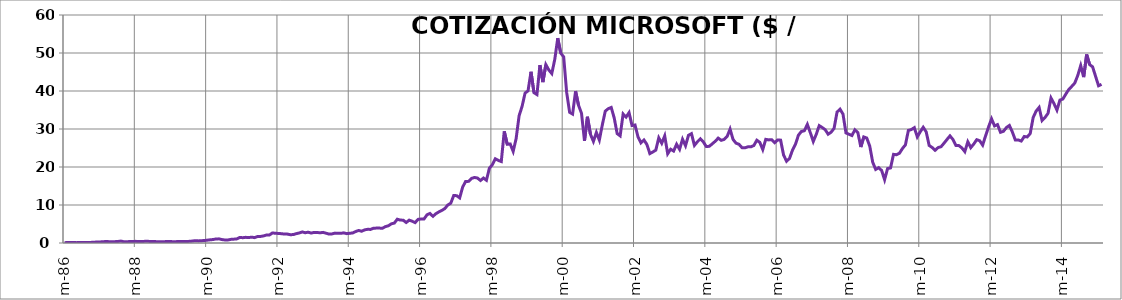
| Category | COTIZACIÓN MICROSOFT ($ / ACCIÓN) |
|---|---|
| 1986-03-13 | 0.097 |
| 1986-04-13 | 0.1 |
| 1986-05-13 | 0.112 |
| 1986-06-13 | 0.109 |
| 1986-07-13 | 0.097 |
| 1986-08-13 | 0.103 |
| 1986-09-13 | 0.098 |
| 1986-10-13 | 0.116 |
| 1986-11-13 | 0.146 |
| 1986-12-13 | 0.164 |
| 1987-01-13 | 0.208 |
| 1987-02-13 | 0.264 |
| 1987-03-13 | 0.287 |
| 1987-04-13 | 0.321 |
| 1987-05-13 | 0.423 |
| 1987-06-13 | 0.341 |
| 1987-07-13 | 0.345 |
| 1987-08-13 | 0.358 |
| 1987-09-13 | 0.404 |
| 1987-10-13 | 0.509 |
| 1987-11-13 | 0.335 |
| 1987-12-13 | 0.333 |
| 1988-01-13 | 0.394 |
| 1988-02-13 | 0.384 |
| 1988-03-13 | 0.434 |
| 1988-04-13 | 0.396 |
| 1988-05-13 | 0.394 |
| 1988-06-13 | 0.433 |
| 1988-07-13 | 0.464 |
| 1988-08-13 | 0.361 |
| 1988-09-13 | 0.375 |
| 1988-10-13 | 0.358 |
| 1988-11-13 | 0.331 |
| 1988-12-13 | 0.332 |
| 1989-01-13 | 0.368 |
| 1989-02-13 | 0.425 |
| 1989-03-13 | 0.366 |
| 1989-04-13 | 0.339 |
| 1989-05-13 | 0.377 |
| 1989-06-13 | 0.398 |
| 1989-07-13 | 0.368 |
| 1989-08-13 | 0.401 |
| 1989-09-13 | 0.432 |
| 1989-10-13 | 0.511 |
| 1989-11-13 | 0.612 |
| 1989-12-13 | 0.556 |
| 1990-01-13 | 0.598 |
| 1990-02-13 | 0.658 |
| 1990-03-13 | 0.738 |
| 1990-04-13 | 0.839 |
| 1990-05-13 | 0.91 |
| 1990-06-13 | 1.063 |
| 1990-07-13 | 1.089 |
| 1990-08-13 | 0.903 |
| 1990-09-13 | 0.799 |
| 1990-10-13 | 0.792 |
| 1990-11-13 | 0.953 |
| 1990-12-13 | 1.01 |
| 1991-01-13 | 1.083 |
| 1991-02-13 | 1.465 |
| 1991-03-13 | 1.396 |
| 1991-04-13 | 1.49 |
| 1991-05-13 | 1.432 |
| 1991-06-13 | 1.542 |
| 1991-07-13 | 1.417 |
| 1991-08-13 | 1.719 |
| 1991-09-13 | 1.729 |
| 1991-10-13 | 1.867 |
| 1991-11-13 | 2.104 |
| 1991-12-13 | 2.125 |
| 1992-01-13 | 2.649 |
| 1992-02-13 | 2.552 |
| 1992-03-13 | 2.521 |
| 1992-04-13 | 2.448 |
| 1992-05-13 | 2.349 |
| 1992-06-13 | 2.344 |
| 1992-07-13 | 2.188 |
| 1992-08-13 | 2.215 |
| 1992-09-13 | 2.461 |
| 1992-10-13 | 2.633 |
| 1992-11-13 | 2.914 |
| 1992-12-13 | 2.699 |
| 1993-01-13 | 2.852 |
| 1993-02-13 | 2.613 |
| 1993-03-13 | 2.781 |
| 1993-04-13 | 2.777 |
| 1993-05-13 | 2.68 |
| 1993-06-13 | 2.793 |
| 1993-07-13 | 2.586 |
| 1993-08-13 | 2.352 |
| 1993-09-13 | 2.387 |
| 1993-10-13 | 2.602 |
| 1993-11-13 | 2.559 |
| 1993-12-13 | 2.543 |
| 1994-01-13 | 2.668 |
| 1994-02-13 | 2.461 |
| 1994-03-13 | 2.555 |
| 1994-04-13 | 2.652 |
| 1994-05-13 | 3.016 |
| 1994-06-13 | 3.305 |
| 1994-07-13 | 3.094 |
| 1994-08-13 | 3.453 |
| 1994-09-13 | 3.598 |
| 1994-10-13 | 3.578 |
| 1994-11-13 | 3.891 |
| 1994-12-13 | 3.922 |
| 1995-01-13 | 3.922 |
| 1995-02-13 | 3.875 |
| 1995-03-13 | 4.312 |
| 1995-04-13 | 4.531 |
| 1995-05-13 | 5.047 |
| 1995-06-13 | 5.242 |
| 1995-07-13 | 6.258 |
| 1995-08-13 | 6.031 |
| 1995-09-13 | 6.008 |
| 1995-10-13 | 5.391 |
| 1995-11-13 | 6.02 |
| 1995-12-13 | 5.734 |
| 1996-01-13 | 5.359 |
| 1996-02-13 | 6.227 |
| 1996-03-13 | 6.305 |
| 1996-04-13 | 6.32 |
| 1996-05-13 | 7.414 |
| 1996-06-13 | 7.789 |
| 1996-07-13 | 7.023 |
| 1996-08-13 | 7.719 |
| 1996-09-13 | 8.188 |
| 1996-10-13 | 8.57 |
| 1996-11-13 | 9.062 |
| 1996-12-13 | 10 |
| 1997-01-13 | 10.469 |
| 1997-02-13 | 12.5 |
| 1997-03-13 | 12.453 |
| 1997-04-13 | 11.875 |
| 1997-05-13 | 14.719 |
| 1997-06-13 | 16.203 |
| 1997-07-13 | 16.219 |
| 1997-08-13 | 17.008 |
| 1997-09-13 | 17.242 |
| 1997-10-13 | 17.094 |
| 1997-11-13 | 16.445 |
| 1997-12-13 | 17.094 |
| 1998-01-13 | 16.516 |
| 1998-02-13 | 19.688 |
| 1998-03-13 | 20.594 |
| 1998-04-13 | 22.156 |
| 1998-05-13 | 21.734 |
| 1998-06-13 | 21.438 |
| 1998-07-13 | 29.391 |
| 1998-08-13 | 25.984 |
| 1998-09-13 | 26.062 |
| 1998-10-13 | 24.109 |
| 1998-11-13 | 27.5 |
| 1998-12-13 | 33.5 |
| 1999-01-13 | 35.953 |
| 1999-02-13 | 39.438 |
| 1999-03-13 | 40.047 |
| 1999-04-13 | 45.062 |
| 1999-05-13 | 39.562 |
| 1999-06-13 | 39.062 |
| 1999-07-13 | 46.812 |
| 1999-08-13 | 42.344 |
| 1999-09-13 | 46.938 |
| 1999-10-13 | 45.531 |
| 1999-11-13 | 44.594 |
| 1999-12-13 | 48.312 |
| 2000-01-13 | 53.906 |
| 2000-02-13 | 49.969 |
| 2000-03-13 | 49 |
| 2000-04-13 | 39.625 |
| 2000-05-13 | 34.406 |
| 2000-06-13 | 33.938 |
| 2000-07-13 | 39.969 |
| 2000-08-13 | 36.219 |
| 2000-09-13 | 34.125 |
| 2000-10-13 | 26.875 |
| 2000-11-13 | 33.219 |
| 2000-12-13 | 28.625 |
| 2001-01-13 | 26.75 |
| 2001-02-13 | 29.094 |
| 2001-03-13 | 27.094 |
| 2001-04-13 | 31.09 |
| 2001-05-13 | 34.7 |
| 2001-06-13 | 35.345 |
| 2001-07-13 | 35.67 |
| 2001-08-13 | 32.915 |
| 2001-09-13 | 28.79 |
| 2001-10-13 | 28.19 |
| 2001-11-13 | 33.95 |
| 2001-12-13 | 33.135 |
| 2002-01-13 | 34.305 |
| 2002-02-13 | 30.91 |
| 2002-03-13 | 31.05 |
| 2002-04-13 | 27.965 |
| 2002-05-13 | 26.345 |
| 2002-06-13 | 27.11 |
| 2002-07-13 | 25.93 |
| 2002-08-13 | 23.525 |
| 2002-09-13 | 23.955 |
| 2002-10-13 | 24.435 |
| 2002-11-13 | 27.68 |
| 2002-12-13 | 26.25 |
| 2003-01-13 | 28.195 |
| 2003-02-13 | 23.495 |
| 2003-03-13 | 24.67 |
| 2003-04-13 | 24.2 |
| 2003-05-13 | 25.99 |
| 2003-06-13 | 24.65 |
| 2003-07-13 | 27.309 |
| 2003-08-13 | 25.6 |
| 2003-09-13 | 28.34 |
| 2003-10-13 | 28.78 |
| 2003-11-13 | 25.69 |
| 2003-12-13 | 26.65 |
| 2004-01-13 | 27.43 |
| 2004-02-13 | 26.59 |
| 2004-03-13 | 25.38 |
| 2004-04-13 | 25.45 |
| 2004-05-13 | 26.1 |
| 2004-06-13 | 26.77 |
| 2004-07-13 | 27.6 |
| 2004-08-13 | 27.02 |
| 2004-09-13 | 27.25 |
| 2004-10-13 | 28.03 |
| 2004-11-13 | 29.97 |
| 2004-12-13 | 27.25 |
| 2005-01-13 | 26.27 |
| 2005-02-13 | 25.97 |
| 2005-03-13 | 25.09 |
| 2005-04-13 | 25.04 |
| 2005-05-13 | 25.3 |
| 2005-06-13 | 25.31 |
| 2005-07-13 | 25.66 |
| 2005-08-13 | 27.05 |
| 2005-09-13 | 26.48 |
| 2005-10-13 | 24.59 |
| 2005-11-13 | 27.28 |
| 2005-12-13 | 27.13 |
| 2006-01-13 | 27.19 |
| 2006-02-13 | 26.39 |
| 2006-03-13 | 27.11 |
| 2006-04-13 | 27.07 |
| 2006-05-13 | 23.17 |
| 2006-06-13 | 21.51 |
| 2006-07-13 | 22.26 |
| 2006-08-13 | 24.43 |
| 2006-09-13 | 25.98 |
| 2006-10-13 | 28.37 |
| 2006-11-13 | 29.35 |
| 2006-12-13 | 29.55 |
| 2007-01-13 | 31.21 |
| 2007-02-13 | 29.03 |
| 2007-03-13 | 26.72 |
| 2007-04-13 | 28.61 |
| 2007-05-13 | 30.89 |
| 2007-06-13 | 30.39 |
| 2007-07-13 | 29.82 |
| 2007-08-13 | 28.63 |
| 2007-09-13 | 29.16 |
| 2007-10-13 | 30.17 |
| 2007-11-13 | 34.46 |
| 2007-12-13 | 35.22 |
| 2008-01-13 | 33.91 |
| 2008-02-13 | 28.96 |
| 2008-03-13 | 28.62 |
| 2008-04-13 | 28.28 |
| 2008-05-13 | 29.78 |
| 2008-06-13 | 29.07 |
| 2008-07-13 | 25.25 |
| 2008-08-13 | 27.91 |
| 2008-09-13 | 27.62 |
| 2008-10-13 | 25.5 |
| 2008-11-13 | 21.25 |
| 2008-12-13 | 19.36 |
| 2009-01-13 | 19.82 |
| 2009-02-13 | 19.09 |
| 2009-03-13 | 16.65 |
| 2009-04-13 | 19.59 |
| 2009-05-13 | 19.75 |
| 2009-06-13 | 23.33 |
| 2009-07-13 | 23.23 |
| 2009-08-13 | 23.62 |
| 2009-09-13 | 24.86 |
| 2009-10-13 | 25.81 |
| 2009-11-13 | 29.63 |
| 2009-12-13 | 29.85 |
| 2010-01-13 | 30.35 |
| 2010-02-13 | 27.93 |
| 2010-03-13 | 29.27 |
| 2010-04-13 | 30.45 |
| 2010-05-13 | 29.24 |
| 2010-06-13 | 25.66 |
| 2010-07-13 | 25.13 |
| 2010-08-13 | 24.4 |
| 2010-09-13 | 25.11 |
| 2010-10-13 | 25.34 |
| 2010-11-13 | 26.27 |
| 2010-12-13 | 27.245 |
| 2011-01-13 | 28.19 |
| 2011-02-13 | 27.25 |
| 2011-03-13 | 25.68 |
| 2011-04-13 | 25.63 |
| 2011-05-13 | 25.03 |
| 2011-06-13 | 24.04 |
| 2011-07-13 | 26.63 |
| 2011-08-13 | 25.1 |
| 2011-09-13 | 26.04 |
| 2011-10-13 | 27.18 |
| 2011-11-13 | 26.91 |
| 2011-12-13 | 25.76 |
| 2012-01-13 | 28.25 |
| 2012-02-13 | 30.58 |
| 2012-03-13 | 32.67 |
| 2012-04-13 | 30.81 |
| 2012-05-13 | 31.16 |
| 2012-06-13 | 29.13 |
| 2012-07-13 | 29.39 |
| 2012-08-13 | 30.39 |
| 2012-09-13 | 30.935 |
| 2012-10-13 | 29.2 |
| 2012-11-13 | 27.09 |
| 2012-12-13 | 27.11 |
| 2013-01-13 | 26.83 |
| 2013-02-13 | 28.03 |
| 2013-03-13 | 27.915 |
| 2013-04-13 | 28.79 |
| 2013-05-13 | 33.03 |
| 2013-06-13 | 34.715 |
| 2013-07-13 | 35.67 |
| 2013-08-13 | 32.23 |
| 2013-09-13 | 33.03 |
| 2013-10-13 | 34.13 |
| 2013-11-13 | 38.155 |
| 2013-12-13 | 36.69 |
| 2014-01-13 | 34.98 |
| 2014-02-13 | 37.61 |
| 2014-03-13 | 37.89 |
| 2014-04-13 | 39.209 |
| 2014-05-13 | 40.42 |
| 2014-06-13 | 41.23 |
| 2014-07-13 | 42.09 |
| 2014-08-13 | 44.08 |
| 2014-09-13 | 46.695 |
| 2014-10-13 | 43.65 |
| 2014-11-13 | 49.61 |
| 2014-12-13 | 46.95 |
| 2015-01-13 | 46.355 |
| 2015-02-13 | 43.87 |
| 2015-03-13 | 41.38 |
| 2015-04-13 | 41.76 |